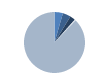
| Category | Series 0 |
|---|---|
| 0 | 66 |
| 1 | 63 |
| 2 | 42 |
| 3 | 9 |
| 4 | 1298 |